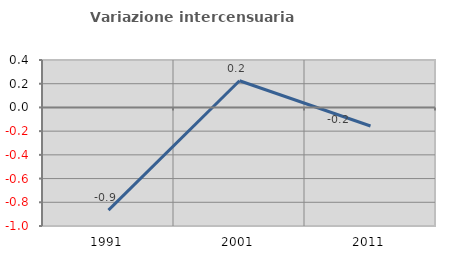
| Category | Variazione intercensuaria annua |
|---|---|
| 1991.0 | -0.866 |
| 2001.0 | 0.225 |
| 2011.0 | -0.157 |